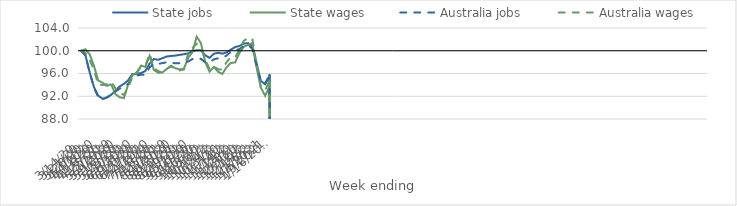
| Category | State jobs | State wages | Australia jobs | Australia wages |
|---|---|---|---|---|
| 14/03/2020 | 100 | 100 | 100 | 100 |
| 21/03/2020 | 99.197 | 100.27 | 99.215 | 99.668 |
| 28/03/2020 | 96.181 | 99.373 | 96.153 | 98.379 |
| 04/04/2020 | 93.611 | 97.333 | 93.502 | 96.626 |
| 11/04/2020 | 92.091 | 94.756 | 91.838 | 94.061 |
| 18/04/2020 | 91.568 | 94.399 | 91.448 | 93.977 |
| 25/04/2020 | 91.757 | 93.781 | 91.813 | 94.111 |
| 02/05/2020 | 92.254 | 94.135 | 92.231 | 94.578 |
| 09/05/2020 | 92.985 | 92.397 | 92.806 | 93.416 |
| 16/05/2020 | 93.73 | 91.817 | 93.353 | 92.605 |
| 23/05/2020 | 94.173 | 91.675 | 93.674 | 92.236 |
| 30/05/2020 | 94.815 | 94.099 | 94.181 | 93.508 |
| 06/06/2020 | 95.927 | 95.736 | 95.128 | 95.497 |
| 13/06/2020 | 95.938 | 96.137 | 95.639 | 96.189 |
| 20/06/2020 | 96.084 | 97.394 | 95.802 | 97.174 |
| 27/06/2020 | 96.444 | 97.155 | 95.768 | 97.323 |
| 04/07/2020 | 97.726 | 99.087 | 97.053 | 99.476 |
| 11/07/2020 | 98.551 | 96.621 | 97.772 | 96.928 |
| 18/07/2020 | 98.414 | 96.136 | 97.691 | 96.451 |
| 25/07/2020 | 98.69 | 96.174 | 97.829 | 96.097 |
| 01/08/2020 | 98.994 | 96.813 | 97.979 | 96.806 |
| 08/08/2020 | 99.089 | 97.37 | 97.922 | 97.248 |
| 15/08/2020 | 99.144 | 96.929 | 97.789 | 96.723 |
| 22/08/2020 | 99.279 | 96.733 | 97.812 | 96.531 |
| 29/08/2020 | 99.386 | 96.795 | 97.884 | 96.715 |
| 05/09/2020 | 99.536 | 98.748 | 98.101 | 99.468 |
| 12/09/2020 | 99.911 | 99.717 | 98.536 | 100.455 |
| 19/09/2020 | 100.095 | 102.472 | 98.701 | 101.226 |
| 26/09/2020 | 100.083 | 101.324 | 98.574 | 100.61 |
| 03/10/2020 | 99.207 | 98.008 | 97.954 | 98.463 |
| 10/10/2020 | 98.752 | 96.319 | 97.882 | 96.815 |
| 17/10/2020 | 99.46 | 97.155 | 98.486 | 97.316 |
| 24/10/2020 | 99.634 | 96.311 | 98.675 | 96.732 |
| 31/10/2020 | 99.488 | 95.935 | 98.779 | 96.679 |
| 07/11/2020 | 99.709 | 97.133 | 99.161 | 98.026 |
| 14/11/2020 | 100.197 | 97.848 | 99.803 | 98.893 |
| 21/11/2020 | 100.649 | 97.949 | 100.059 | 98.847 |
| 28/11/2020 | 100.844 | 99.642 | 100.31 | 100.101 |
| 05/12/2020 | 101.25 | 100.703 | 100.817 | 101.732 |
| 12/12/2020 | 101.346 | 101.005 | 101.015 | 102.219 |
| 19/12/2020 | 100.719 | 101.342 | 100.355 | 102.16 |
| 26/12/2020 | 97.808 | 97.062 | 97.322 | 97.485 |
| 02/01/2021 | 94.696 | 93.515 | 94.445 | 93.574 |
| 09/01/2021 | 94.113 | 92.085 | 94.284 | 92.978 |
| 16/01/2021 | 95.403 | 93.633 | 95.7 | 94.76 |